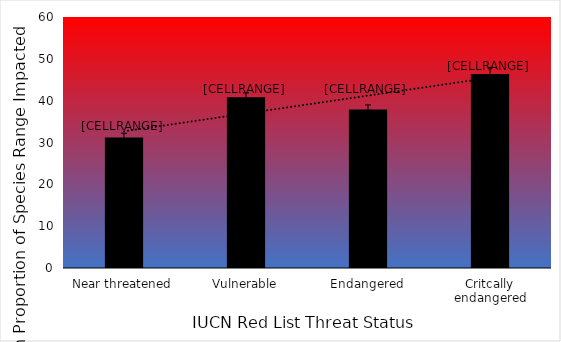
| Category | Series 0 |
|---|---|
| Near threatened | 31.2 |
| Vulnerable | 40.8 |
| Endangered | 37.9 |
| Critcally endangered | 46.4 |